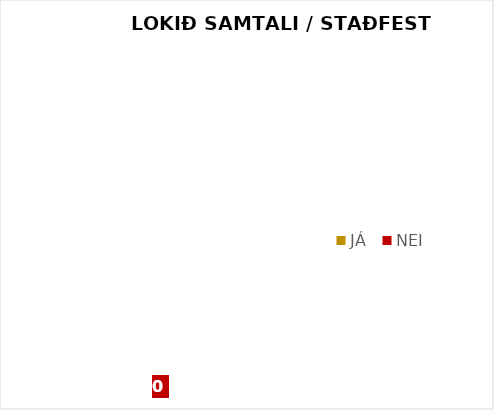
| Category | JÁ | NEI |
|---|---|---|
| 0 | 0 | 0 |